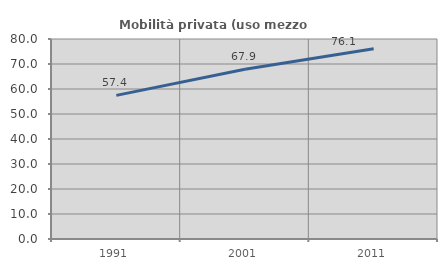
| Category | Mobilità privata (uso mezzo privato) |
|---|---|
| 1991.0 | 57.444 |
| 2001.0 | 67.909 |
| 2011.0 | 76.085 |